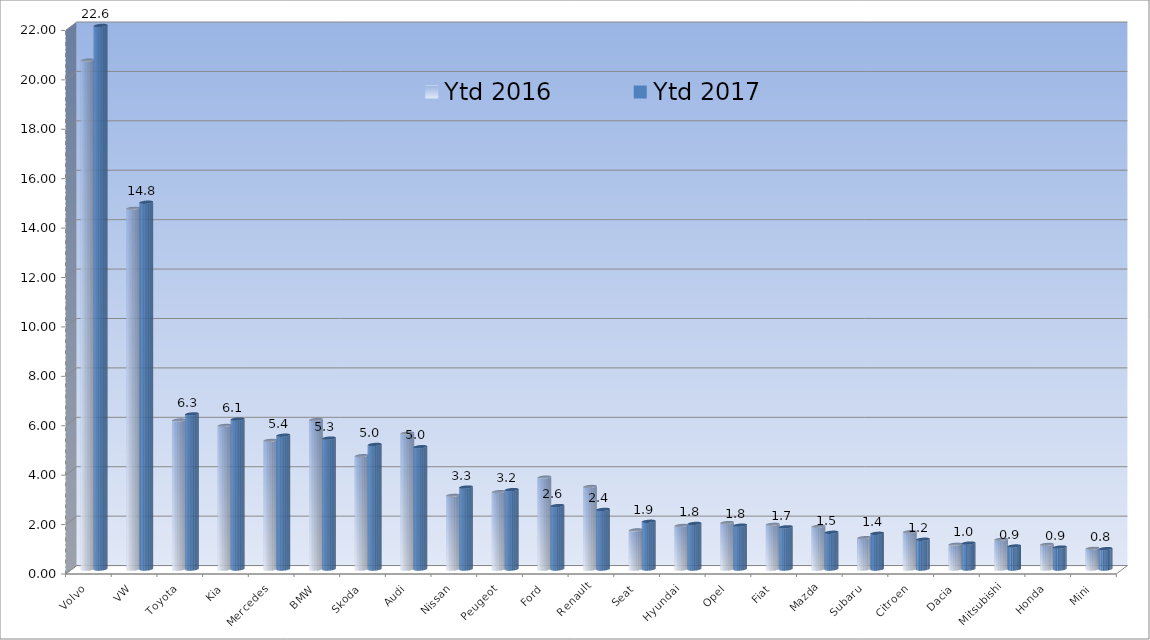
| Category | Ytd 2016 | Ytd 2017 |
|---|---|---|
| Volvo | 20.596 | 22.593 |
| VW | 14.6 | 14.846 |
| Toyota | 6.029 | 6.277 |
| Kia | 5.812 | 6.068 |
| Mercedes | 5.206 | 5.416 |
| BMW | 6.046 | 5.298 |
| Skoda | 4.585 | 5.041 |
| Audi | 5.499 | 4.95 |
| Nissan | 2.984 | 3.315 |
| Peugeot | 3.129 | 3.213 |
| Ford | 3.719 | 2.566 |
| Renault | 3.338 | 2.411 |
| Seat | 1.582 | 1.932 |
| Hyundai | 1.761 | 1.844 |
| Opel | 1.877 | 1.774 |
| Fiat | 1.811 | 1.707 |
| Mazda | 1.727 | 1.487 |
| Subaru | 1.268 | 1.445 |
| Citroen | 1.509 | 1.205 |
| Dacia | 1.004 | 1.048 |
| Mitsubishi | 1.2 | 0.931 |
| Honda | 0.996 | 0.886 |
| Mini | 0.836 | 0.824 |